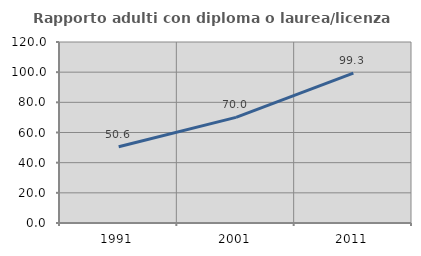
| Category | Rapporto adulti con diploma o laurea/licenza media  |
|---|---|
| 1991.0 | 50.6 |
| 2001.0 | 70.039 |
| 2011.0 | 99.334 |